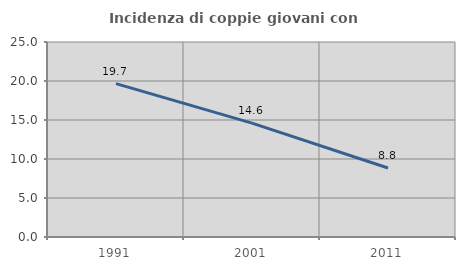
| Category | Incidenza di coppie giovani con figli |
|---|---|
| 1991.0 | 19.658 |
| 2001.0 | 14.599 |
| 2011.0 | 8.844 |